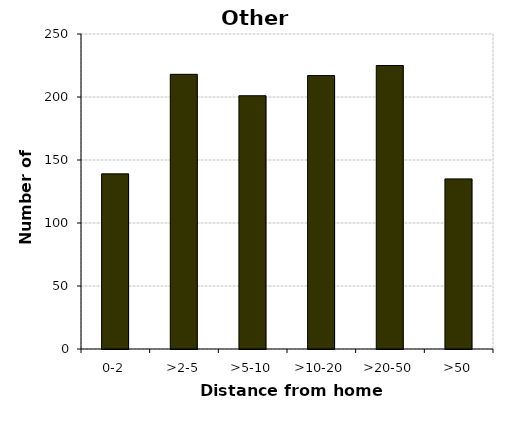
| Category | Other vehicles |
|---|---|
| 0-2 | 139 |
| >2-5 | 218 |
| >5-10 | 201 |
| >10-20 | 217 |
| >20-50 | 225 |
| >50 | 135 |